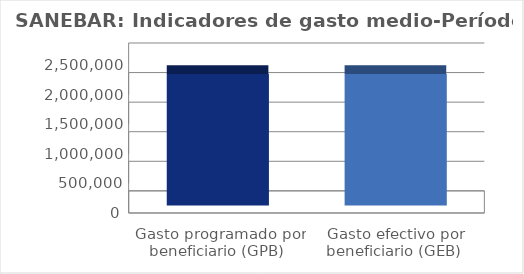
| Category | Series 0 |
|---|---|
| Gasto programado por beneficiario (GPB)  | 2222222 |
| Gasto efectivo por beneficiario (GEB)  | 2222222 |